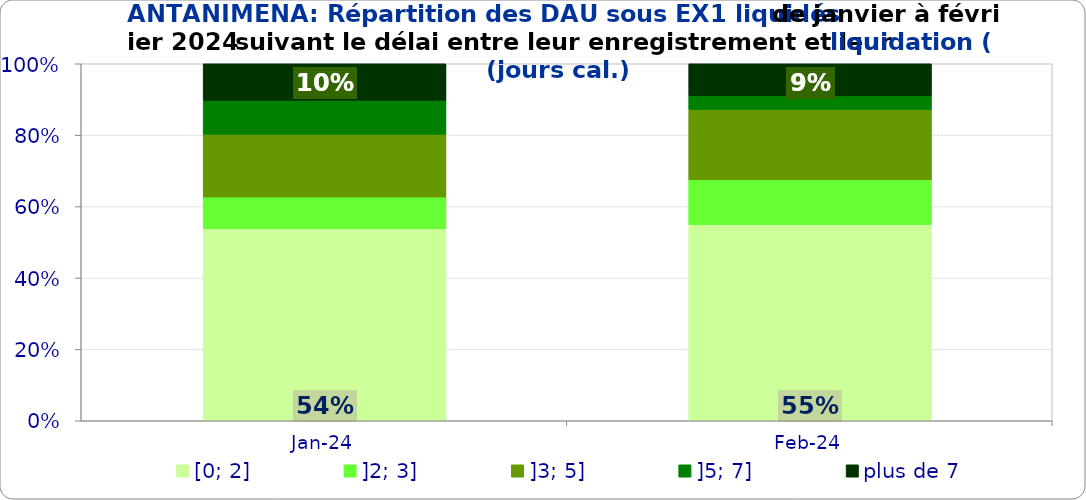
| Category | [0; 2] | ]2; 3] | ]3; 5] | ]5; 7] | plus de 7 |
|---|---|---|---|---|---|
| 2024-01-01 | 0.538 | 0.089 | 0.176 | 0.095 | 0.102 |
| 2024-02-01 | 0.55 | 0.126 | 0.197 | 0.038 | 0.09 |